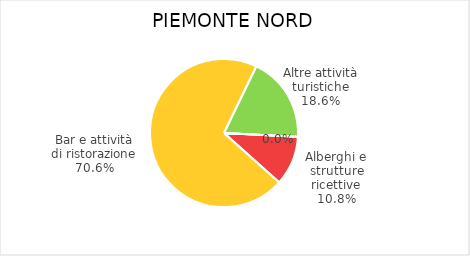
| Category | Piemonte Nord |
|---|---|
| Alberghi e strutture ricettive | 959 |
| Bar e attività di ristorazione | 6272 |
| Altre attività turistiche | 1657 |